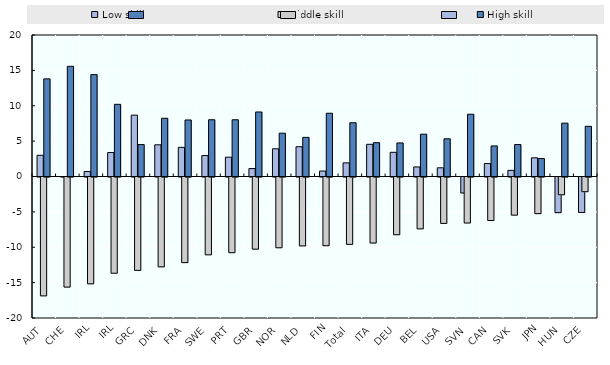
| Category | Low skill | Middle skill | High skill |
|---|---|---|---|
| AUT | 3 | -16.8 | 13.8 |
| CHE | -0.01 | -15.56 | 15.57 |
| IRL | 0.71 | -15.1 | 14.4 |
| IRL | 3.39 | -13.6 | 10.2 |
| GRC | 8.67 | -13.2 | 4.51 |
| DNK | 4.48 | -12.7 | 8.23 |
| FRA | 4.12 | -12.1 | 7.99 |
| SWE | 2.96 | -11 | 8.02 |
| PRT | 2.73 | -10.7 | 8.02 |
| GBR | 1.12 | -10.2 | 9.12 |
| NOR | 3.92 | -10 | 6.12 |
| NLD | 4.21 | -9.74 | 5.53 |
| FIN | 0.77 | -9.71 | 8.94 |
| Total | 1.93 | -9.52 | 7.6 |
| ITA | 4.55 | -9.33 | 4.78 |
| DEU | 3.42 | -8.16 | 4.74 |
| BEL | 1.35 | -7.33 | 5.98 |
| USA | 1.23 | -6.56 | 5.33 |
| SVN | -2.26 | -6.5 | 8.8 |
| CAN | 1.83 | -6.15 | 4.32 |
| SVK | 0.87 | -5.39 | 4.52 |
| JPN | 2.64 | -5.18 | 2.54 |
| HUN | -5.04 | -2.51 | 7.54 |
| CZE | -5.01 | -2.08 | 7.09 |